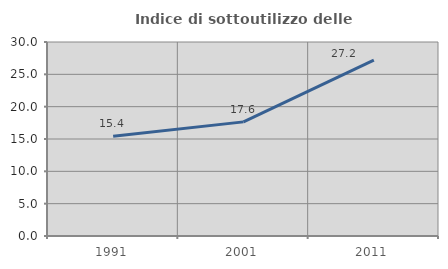
| Category | Indice di sottoutilizzo delle abitazioni  |
|---|---|
| 1991.0 | 15.416 |
| 2001.0 | 17.647 |
| 2011.0 | 27.189 |